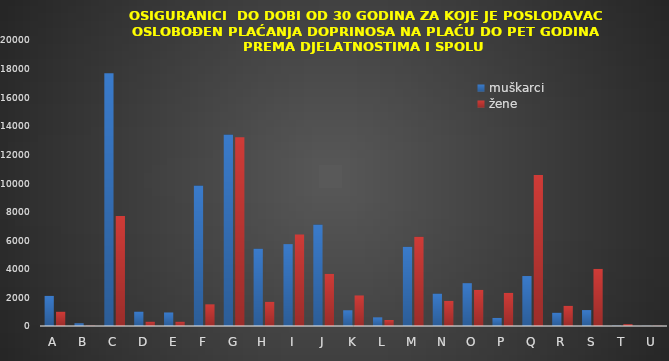
| Category | muškarci | žene |
|---|---|---|
| A | 2106 | 1001 |
| B | 191 | 24 |
| C | 17682 | 7684 |
| D | 1009 | 302 |
| E | 946 | 301 |
| F | 9819 | 1514 |
| G | 13389 | 13196 |
| H | 5411 | 1692 |
| I | 5726 | 6400 |
| J | 7096 | 3643 |
| K | 1100 | 2135 |
| L | 605 | 418 |
| M | 5538 | 6239 |
| N | 2269 | 1756 |
| O | 2994 | 2524 |
| P | 564 | 2314 |
| Q | 3494 | 10565 |
| R | 928 | 1409 |
| S | 1113 | 3991 |
| T | 18 | 127 |
| U | 10 | 13 |